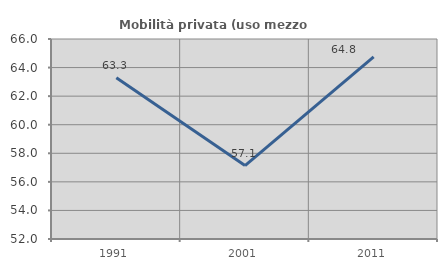
| Category | Mobilità privata (uso mezzo privato) |
|---|---|
| 1991.0 | 63.281 |
| 2001.0 | 57.143 |
| 2011.0 | 64.754 |